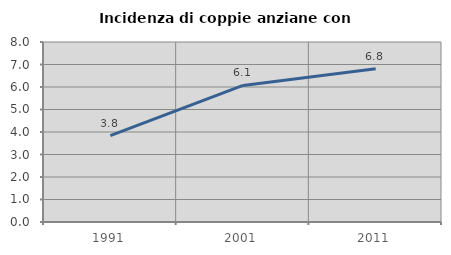
| Category | Incidenza di coppie anziane con figli |
|---|---|
| 1991.0 | 3.836 |
| 2001.0 | 6.069 |
| 2011.0 | 6.812 |